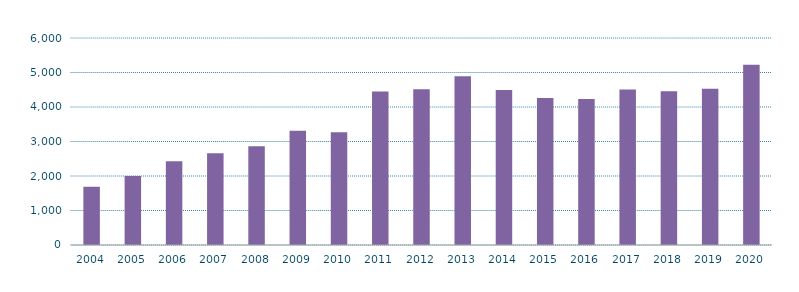
| Category | Nacional |
|---|---|
| 2004.0 | 1690.876 |
| 2005.0 | 2001.899 |
| 2006.0 | 2430.316 |
| 2007.0 | 2660.078 |
| 2008.0 | 2861.018 |
| 2009.0 | 3309.563 |
| 2010.0 | 3267.591 |
| 2011.0 | 4450.09 |
| 2012.0 | 4510.873 |
| 2013.0 | 4890.025 |
| 2014.0 | 4495.277 |
| 2015.0 | 4258.849 |
| 2016.0 | 4228.952 |
| 2017.0 | 4507.587 |
| 2018.0 | 4455.17 |
| 2019.0 | 4530.778 |
| 2020.0 | 5225.298 |